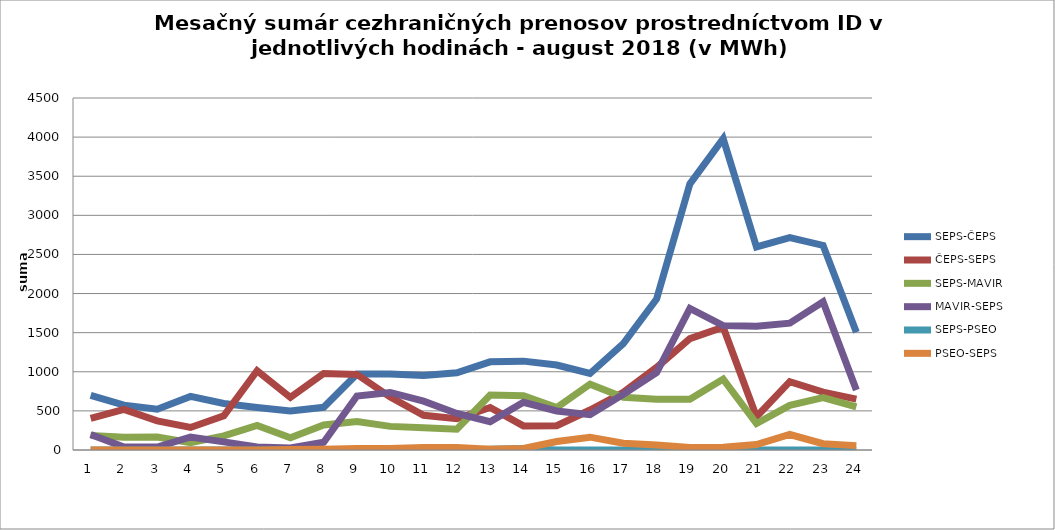
| Category | SEPS-ČEPS | ČEPS-SEPS | SEPS-MAVIR | MAVIR-SEPS | SEPS-PSEO | PSEO-SEPS |
|---|---|---|---|---|---|---|
| 1.0 | 699 | 405 | 184 | 199 | 0 | 0 |
| 2.0 | 574 | 520 | 164 | 38 | 0 | 0 |
| 3.0 | 522 | 373 | 166 | 38 | 0 | 0 |
| 4.0 | 685 | 288 | 93 | 166 | 0 | 0 |
| 5.0 | 594 | 436 | 181 | 104 | 0 | 0 |
| 6.0 | 544 | 1014 | 314 | 38 | 0 | 0 |
| 7.0 | 500 | 672 | 157 | 27 | 0 | 5 |
| 8.0 | 546 | 979 | 320 | 100 | 0 | 10 |
| 9.0 | 971 | 966 | 364 | 690 | 0 | 20 |
| 10.0 | 971 | 676 | 302 | 736 | 0 | 20 |
| 11.0 | 952 | 444 | 286 | 625 | 0 | 33 |
| 12.0 | 988 | 399 | 265 | 467 | 0 | 33 |
| 13.0 | 1127 | 544 | 703 | 362 | 10 | 10 |
| 14.0 | 1136 | 308 | 695 | 610 | 20 | 20 |
| 15.0 | 1086 | 311 | 543 | 499 | 0 | 108 |
| 16.0 | 978 | 511 | 842 | 452 | 0 | 164 |
| 17.0 | 1361 | 737 | 675 | 712 | 0 | 87 |
| 18.0 | 1930 | 1056 | 648 | 989 | 0 | 63 |
| 19.0 | 3403 | 1423 | 648 | 1810 | 0 | 33 |
| 20.0 | 3981 | 1570 | 906 | 1591 | 15 | 35 |
| 21.0 | 2596 | 425 | 338 | 1581 | 0 | 69 |
| 22.0 | 2716 | 873 | 571 | 1621 | 0 | 198 |
| 23.0 | 2616 | 739 | 671 | 1896 | 0 | 81 |
| 24.0 | 1506 | 650 | 550 | 768 | 0 | 56 |